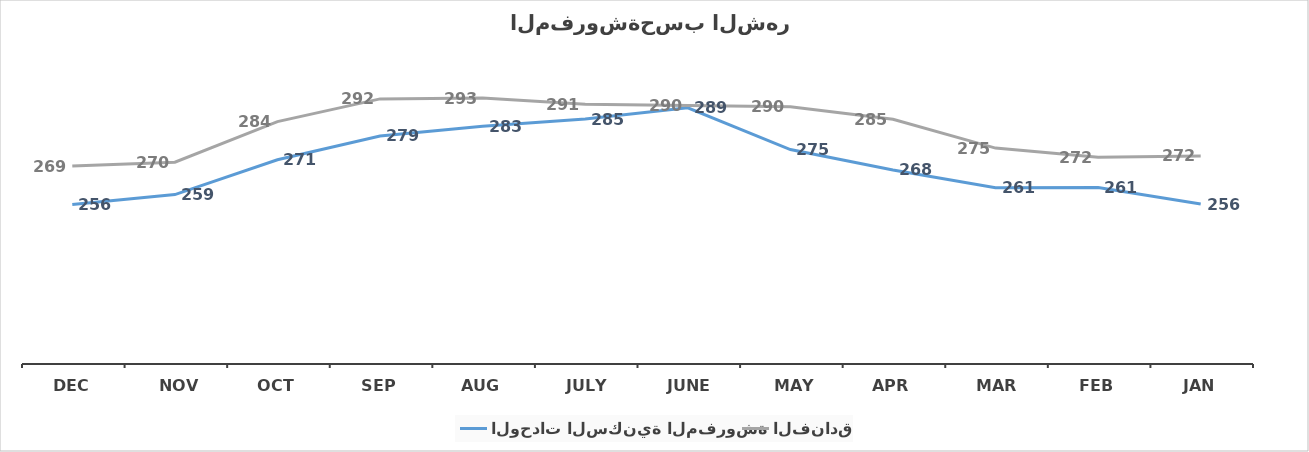
| Category | الوحدات السكنية المفروشة | الفنادق |
|---|---|---|
| Jan | 255.714 | 272.486 |
| Feb | 261.479 | 272.04 |
| Mar | 261.419 | 275.227 |
| Apr | 267.628 | 285.285 |
| May | 274.71 | 289.597 |
| June | 289.269 | 290.097 |
| July | 285.346 | 290.502 |
| Aug | 282.838 | 292.646 |
| Sep | 279.452 | 292.377 |
| Oct | 271.161 | 284.459 |
| Nov | 259.039 | 270.298 |
| Dec | 255.59 | 268.95 |